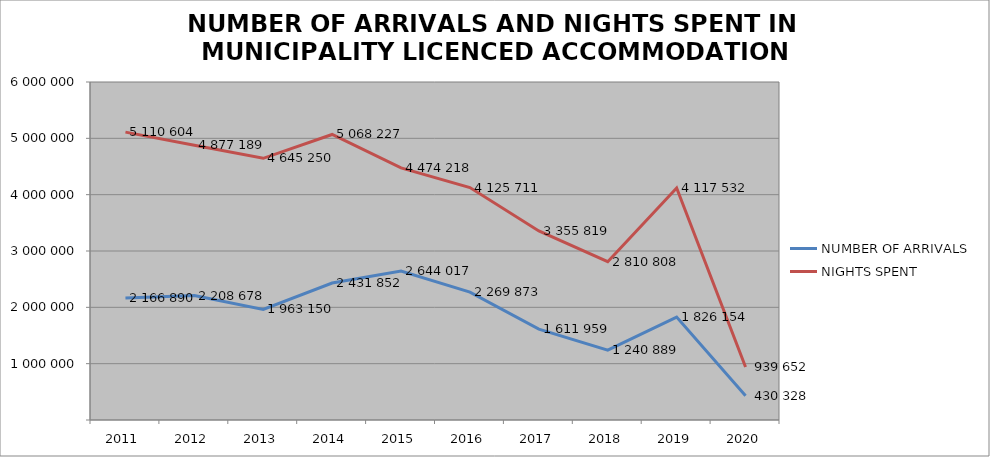
| Category | NUMBER OF ARRIVALS | NIGHTS SPENT |
|---|---|---|
| 2011 | 2166890 | 5110604 |
| 2012 | 2208678 | 4877189 |
| 2013 | 1963150 | 4645250 |
| 2014 | 2431852 | 5068227 |
| 2015 | 2644017 | 4474218 |
| 2016 | 2269873 | 4125711 |
| 2017 | 1611959 | 3355819 |
| 2018 | 1240889 | 2810808 |
| 2019 | 1826154 | 4117532 |
| 2020 | 430328 | 939652 |